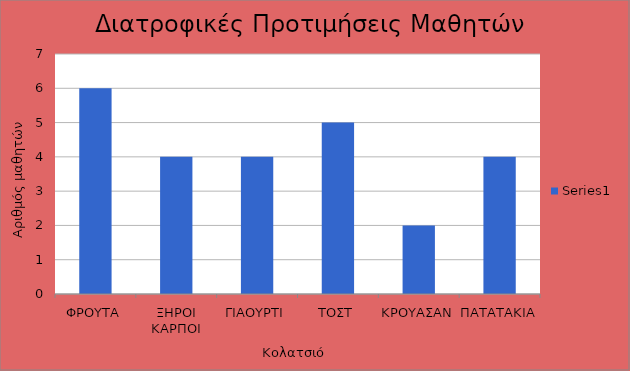
| Category | Series 0 |
|---|---|
| ΦΡΟΥΤΑ | 6 |
| ΞΗΡΟΙ ΚΑΡΠΟΙ | 4 |
| ΓΙΑΟΥΡΤΙ | 4 |
| ΤΟΣΤ | 5 |
| ΚΡΟΥΑΣΑΝ | 2 |
| ΠΑΤΑΤΑΚΙΑ | 4 |